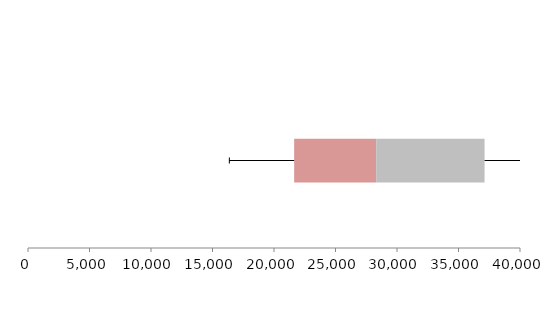
| Category | Series 1 | Series 2 | Series 3 |
|---|---|---|---|
| 0 | 21639.577 | 6669.125 | 8810.654 |